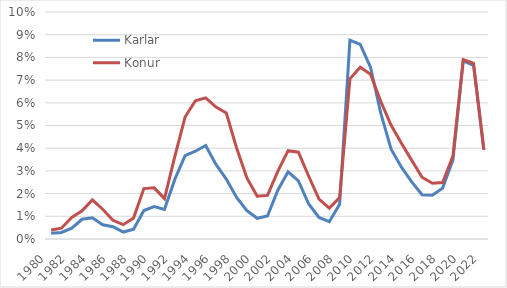
| Category | Karlar | Konur |
|---|---|---|
| 1980.0 | 0.257 | 0.394 |
| 1981.0 | 0.291 | 0.475 |
| 1982.0 | 0.478 | 0.952 |
| 1983.0 | 0.87 | 1.244 |
| 1984.0 | 0.933 | 1.723 |
| 1985.0 | 0.629 | 1.31 |
| 1986.0 | 0.542 | 0.822 |
| 1987.0 | 0.306 | 0.632 |
| 1988.0 | 0.432 | 0.924 |
| 1989.0 | 1.254 | 2.222 |
| 1990.0 | 1.432 | 2.253 |
| 1991.0 | 1.3 | 1.777 |
| 1992.0 | 2.626 | 3.632 |
| 1993.0 | 3.671 | 5.373 |
| 1994.0 | 3.868 | 6.092 |
| 1995.0 | 4.121 | 6.215 |
| 1996.0 | 3.287 | 5.81 |
| 1997.0 | 2.639 | 5.549 |
| 1998.0 | 1.833 | 4.012 |
| 1999.0 | 1.248 | 2.693 |
| 2000.0 | 0.912 | 1.885 |
| 2001.0 | 1.014 | 1.922 |
| 2002.0 | 2.147 | 2.977 |
| 2003.0 | 2.96 | 3.891 |
| 2004.0 | 2.564 | 3.825 |
| 2005.0 | 1.542 | 2.764 |
| 2006.0 | 0.948 | 1.756 |
| 2007.0 | 0.764 | 1.358 |
| 2008.0 | 1.525 | 1.823 |
| 2009.0 | 8.757 | 7.055 |
| 2010.0 | 8.577 | 7.562 |
| 2011.0 | 7.562 | 7.259 |
| 2012.0 | 5.535 | 6.055 |
| 2013.0 | 3.952 | 5.009 |
| 2014.0 | 3.166 | 4.215 |
| 2015.0 | 2.515 | 3.463 |
| 2016.0 | 1.948 | 2.723 |
| 2017.0 | 1.926 | 2.453 |
| 2018.0 | 2.241 | 2.486 |
| 2019.0 | 3.488 | 3.656 |
| 2020.0 | 7.851 | 7.906 |
| 2021.0 | 7.643 | 7.735 |
| 2022.0 | 3.936 | 3.931 |